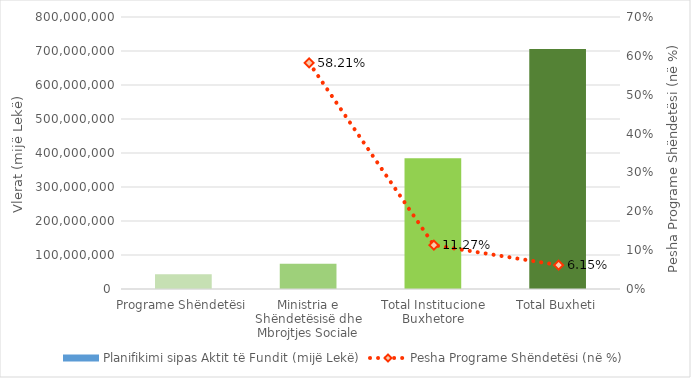
| Category | Planifikimi sipas Aktit të Fundit (mijë Lekë) |
|---|---|
| Programe Shëndetësi | 43362650 |
| Ministria e Shëndetësisë dhe Mbrojtjes Sociale | 74492428 |
| Total Institucione Buxhetore | 384613890 |
| Total Buxheti | 705607000 |